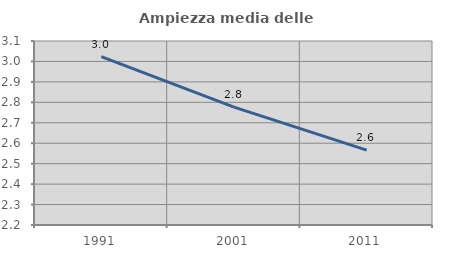
| Category | Ampiezza media delle famiglie |
|---|---|
| 1991.0 | 3.023 |
| 2001.0 | 2.776 |
| 2011.0 | 2.566 |